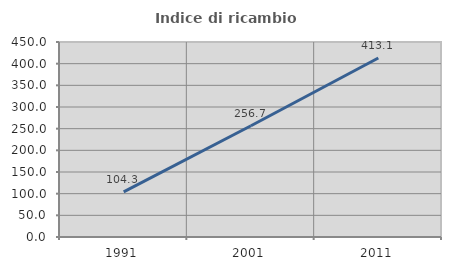
| Category | Indice di ricambio occupazionale  |
|---|---|
| 1991.0 | 104.286 |
| 2001.0 | 256.716 |
| 2011.0 | 413.115 |